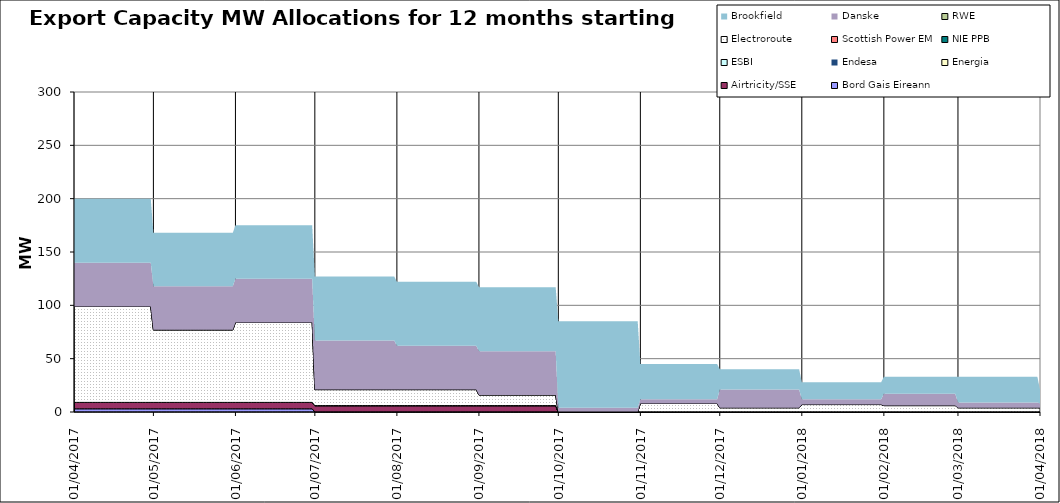
| Category | Bord Gais Eireann | Airtricity/SSE | Energia | Endesa | ESBI | NIE PPB | Scottish Power EM | Electroroute | RWE | Danske | Brookfield  |
|---|---|---|---|---|---|---|---|---|---|---|---|
| 01/04/2017 | 3 | 6 | 0 | 0 | 0 | 0 | 0 | 90 | 0 | 41 | 60 |
| 02/04/2017 | 3 | 6 | 0 | 0 | 0 | 0 | 0 | 90 | 0 | 41 | 60 |
| 03/04/2017 | 3 | 6 | 0 | 0 | 0 | 0 | 0 | 90 | 0 | 41 | 60 |
| 04/04/2017 | 3 | 6 | 0 | 0 | 0 | 0 | 0 | 90 | 0 | 41 | 60 |
| 05/04/2017 | 3 | 6 | 0 | 0 | 0 | 0 | 0 | 90 | 0 | 41 | 60 |
| 06/04/2017 | 3 | 6 | 0 | 0 | 0 | 0 | 0 | 90 | 0 | 41 | 60 |
| 07/04/2017 | 3 | 6 | 0 | 0 | 0 | 0 | 0 | 90 | 0 | 41 | 60 |
| 08/04/2017 | 3 | 6 | 0 | 0 | 0 | 0 | 0 | 90 | 0 | 41 | 60 |
| 09/04/2017 | 3 | 6 | 0 | 0 | 0 | 0 | 0 | 90 | 0 | 41 | 60 |
| 10/04/2017 | 3 | 6 | 0 | 0 | 0 | 0 | 0 | 90 | 0 | 41 | 60 |
| 11/04/2017 | 3 | 6 | 0 | 0 | 0 | 0 | 0 | 90 | 0 | 41 | 60 |
| 12/04/2017 | 3 | 6 | 0 | 0 | 0 | 0 | 0 | 90 | 0 | 41 | 60 |
| 13/04/2017 | 3 | 6 | 0 | 0 | 0 | 0 | 0 | 90 | 0 | 41 | 60 |
| 14/04/2017 | 3 | 6 | 0 | 0 | 0 | 0 | 0 | 90 | 0 | 41 | 60 |
| 15/04/2017 | 3 | 6 | 0 | 0 | 0 | 0 | 0 | 90 | 0 | 41 | 60 |
| 16/04/2017 | 3 | 6 | 0 | 0 | 0 | 0 | 0 | 90 | 0 | 41 | 60 |
| 17/04/2017 | 3 | 6 | 0 | 0 | 0 | 0 | 0 | 90 | 0 | 41 | 60 |
| 18/04/2017 | 3 | 6 | 0 | 0 | 0 | 0 | 0 | 90 | 0 | 41 | 60 |
| 19/04/2017 | 3 | 6 | 0 | 0 | 0 | 0 | 0 | 90 | 0 | 41 | 60 |
| 20/04/2017 | 3 | 6 | 0 | 0 | 0 | 0 | 0 | 90 | 0 | 41 | 60 |
| 21/04/2017 | 3 | 6 | 0 | 0 | 0 | 0 | 0 | 90 | 0 | 41 | 60 |
| 22/04/2017 | 3 | 6 | 0 | 0 | 0 | 0 | 0 | 90 | 0 | 41 | 60 |
| 23/04/2017 | 3 | 6 | 0 | 0 | 0 | 0 | 0 | 90 | 0 | 41 | 60 |
| 24/04/2017 | 3 | 6 | 0 | 0 | 0 | 0 | 0 | 90 | 0 | 41 | 60 |
| 25/04/2017 | 3 | 6 | 0 | 0 | 0 | 0 | 0 | 90 | 0 | 41 | 60 |
| 26/04/2017 | 3 | 6 | 0 | 0 | 0 | 0 | 0 | 90 | 0 | 41 | 60 |
| 27/04/2017 | 3 | 6 | 0 | 0 | 0 | 0 | 0 | 90 | 0 | 41 | 60 |
| 28/04/2017 | 3 | 6 | 0 | 0 | 0 | 0 | 0 | 90 | 0 | 41 | 60 |
| 29/04/2017 | 3 | 6 | 0 | 0 | 0 | 0 | 0 | 90 | 0 | 41 | 60 |
| 30/04/2017 | 3 | 6 | 0 | 0 | 0 | 0 | 0 | 90 | 0 | 41 | 60 |
| 01/05/2017 | 3 | 6 | 0 | 0 | 0 | 0 | 0 | 68 | 0 | 41 | 50 |
| 02/05/2017 | 3 | 6 | 0 | 0 | 0 | 0 | 0 | 68 | 0 | 41 | 50 |
| 03/05/2017 | 3 | 6 | 0 | 0 | 0 | 0 | 0 | 68 | 0 | 41 | 50 |
| 04/05/2017 | 3 | 6 | 0 | 0 | 0 | 0 | 0 | 68 | 0 | 41 | 50 |
| 05/05/2017 | 3 | 6 | 0 | 0 | 0 | 0 | 0 | 68 | 0 | 41 | 50 |
| 06/05/2017 | 3 | 6 | 0 | 0 | 0 | 0 | 0 | 68 | 0 | 41 | 50 |
| 07/05/2017 | 3 | 6 | 0 | 0 | 0 | 0 | 0 | 68 | 0 | 41 | 50 |
| 08/05/2017 | 3 | 6 | 0 | 0 | 0 | 0 | 0 | 68 | 0 | 41 | 50 |
| 09/05/2017 | 3 | 6 | 0 | 0 | 0 | 0 | 0 | 68 | 0 | 41 | 50 |
| 10/05/2017 | 3 | 6 | 0 | 0 | 0 | 0 | 0 | 68 | 0 | 41 | 50 |
| 11/05/2017 | 3 | 6 | 0 | 0 | 0 | 0 | 0 | 68 | 0 | 41 | 50 |
| 12/05/2017 | 3 | 6 | 0 | 0 | 0 | 0 | 0 | 68 | 0 | 41 | 50 |
| 13/05/2017 | 3 | 6 | 0 | 0 | 0 | 0 | 0 | 68 | 0 | 41 | 50 |
| 14/05/2017 | 3 | 6 | 0 | 0 | 0 | 0 | 0 | 68 | 0 | 41 | 50 |
| 15/05/2017 | 3 | 6 | 0 | 0 | 0 | 0 | 0 | 68 | 0 | 41 | 50 |
| 16/05/2017 | 3 | 6 | 0 | 0 | 0 | 0 | 0 | 68 | 0 | 41 | 50 |
| 17/05/2017 | 3 | 6 | 0 | 0 | 0 | 0 | 0 | 68 | 0 | 41 | 50 |
| 18/05/2017 | 3 | 6 | 0 | 0 | 0 | 0 | 0 | 68 | 0 | 41 | 50 |
| 19/05/2017 | 3 | 6 | 0 | 0 | 0 | 0 | 0 | 68 | 0 | 41 | 50 |
| 20/05/2017 | 3 | 6 | 0 | 0 | 0 | 0 | 0 | 68 | 0 | 41 | 50 |
| 21/05/2017 | 3 | 6 | 0 | 0 | 0 | 0 | 0 | 68 | 0 | 41 | 50 |
| 22/05/2017 | 3 | 6 | 0 | 0 | 0 | 0 | 0 | 68 | 0 | 41 | 50 |
| 23/05/2017 | 3 | 6 | 0 | 0 | 0 | 0 | 0 | 68 | 0 | 41 | 50 |
| 24/05/2017 | 3 | 6 | 0 | 0 | 0 | 0 | 0 | 68 | 0 | 41 | 50 |
| 25/05/2017 | 3 | 6 | 0 | 0 | 0 | 0 | 0 | 68 | 0 | 41 | 50 |
| 26/05/2017 | 3 | 6 | 0 | 0 | 0 | 0 | 0 | 68 | 0 | 41 | 50 |
| 27/05/2017 | 3 | 6 | 0 | 0 | 0 | 0 | 0 | 68 | 0 | 41 | 50 |
| 28/05/2017 | 3 | 6 | 0 | 0 | 0 | 0 | 0 | 68 | 0 | 41 | 50 |
| 29/05/2017 | 3 | 6 | 0 | 0 | 0 | 0 | 0 | 68 | 0 | 41 | 50 |
| 30/05/2017 | 3 | 6 | 0 | 0 | 0 | 0 | 0 | 68 | 0 | 41 | 50 |
| 31/05/2017 | 3 | 6 | 0 | 0 | 0 | 0 | 0 | 68 | 0 | 41 | 50 |
| 01/06/2017 | 3 | 6 | 0 | 0 | 0 | 0 | 0 | 75 | 0 | 41 | 50 |
| 02/06/2017 | 3 | 6 | 0 | 0 | 0 | 0 | 0 | 75 | 0 | 41 | 50 |
| 03/06/2017 | 3 | 6 | 0 | 0 | 0 | 0 | 0 | 75 | 0 | 41 | 50 |
| 04/06/2017 | 3 | 6 | 0 | 0 | 0 | 0 | 0 | 75 | 0 | 41 | 50 |
| 05/06/2017 | 3 | 6 | 0 | 0 | 0 | 0 | 0 | 75 | 0 | 41 | 50 |
| 06/06/2017 | 3 | 6 | 0 | 0 | 0 | 0 | 0 | 75 | 0 | 41 | 50 |
| 07/06/2017 | 3 | 6 | 0 | 0 | 0 | 0 | 0 | 75 | 0 | 41 | 50 |
| 08/06/2017 | 3 | 6 | 0 | 0 | 0 | 0 | 0 | 75 | 0 | 41 | 50 |
| 09/06/2017 | 3 | 6 | 0 | 0 | 0 | 0 | 0 | 75 | 0 | 41 | 50 |
| 10/06/2017 | 3 | 6 | 0 | 0 | 0 | 0 | 0 | 75 | 0 | 41 | 50 |
| 11/06/2017 | 3 | 6 | 0 | 0 | 0 | 0 | 0 | 75 | 0 | 41 | 50 |
| 12/06/2017 | 3 | 6 | 0 | 0 | 0 | 0 | 0 | 75 | 0 | 41 | 50 |
| 13/06/2017 | 3 | 6 | 0 | 0 | 0 | 0 | 0 | 75 | 0 | 41 | 50 |
| 14/06/2017 | 3 | 6 | 0 | 0 | 0 | 0 | 0 | 75 | 0 | 41 | 50 |
| 15/06/2017 | 3 | 6 | 0 | 0 | 0 | 0 | 0 | 75 | 0 | 41 | 50 |
| 16/06/2017 | 3 | 6 | 0 | 0 | 0 | 0 | 0 | 75 | 0 | 41 | 50 |
| 17/06/2017 | 3 | 6 | 0 | 0 | 0 | 0 | 0 | 75 | 0 | 41 | 50 |
| 18/06/2017 | 3 | 6 | 0 | 0 | 0 | 0 | 0 | 75 | 0 | 41 | 50 |
| 19/06/2017 | 3 | 6 | 0 | 0 | 0 | 0 | 0 | 75 | 0 | 41 | 50 |
| 20/06/2017 | 3 | 6 | 0 | 0 | 0 | 0 | 0 | 75 | 0 | 41 | 50 |
| 21/06/2017 | 3 | 6 | 0 | 0 | 0 | 0 | 0 | 75 | 0 | 41 | 50 |
| 22/06/2017 | 3 | 6 | 0 | 0 | 0 | 0 | 0 | 75 | 0 | 41 | 50 |
| 23/06/2017 | 3 | 6 | 0 | 0 | 0 | 0 | 0 | 75 | 0 | 41 | 50 |
| 24/06/2017 | 3 | 6 | 0 | 0 | 0 | 0 | 0 | 75 | 0 | 41 | 50 |
| 25/06/2017 | 3 | 6 | 0 | 0 | 0 | 0 | 0 | 75 | 0 | 41 | 50 |
| 26/06/2017 | 3 | 6 | 0 | 0 | 0 | 0 | 0 | 75 | 0 | 41 | 50 |
| 27/06/2017 | 3 | 6 | 0 | 0 | 0 | 0 | 0 | 75 | 0 | 41 | 50 |
| 28/06/2017 | 3 | 6 | 0 | 0 | 0 | 0 | 0 | 75 | 0 | 41 | 50 |
| 29/06/2017 | 3 | 6 | 0 | 0 | 0 | 0 | 0 | 75 | 0 | 41 | 50 |
| 30/06/2017 | 3 | 6 | 0 | 0 | 0 | 0 | 0 | 75 | 0 | 41 | 50 |
| 01/07/2017 | 0 | 6 | 0 | 0 | 0 | 0 | 0 | 15 | 0 | 46 | 60 |
| 02/07/2017 | 0 | 6 | 0 | 0 | 0 | 0 | 0 | 15 | 0 | 46 | 60 |
| 03/07/2017 | 0 | 6 | 0 | 0 | 0 | 0 | 0 | 15 | 0 | 46 | 60 |
| 04/07/2017 | 0 | 6 | 0 | 0 | 0 | 0 | 0 | 15 | 0 | 46 | 60 |
| 05/07/2017 | 0 | 6 | 0 | 0 | 0 | 0 | 0 | 15 | 0 | 46 | 60 |
| 06/07/2017 | 0 | 6 | 0 | 0 | 0 | 0 | 0 | 15 | 0 | 46 | 60 |
| 07/07/2017 | 0 | 6 | 0 | 0 | 0 | 0 | 0 | 15 | 0 | 46 | 60 |
| 08/07/2017 | 0 | 6 | 0 | 0 | 0 | 0 | 0 | 15 | 0 | 46 | 60 |
| 09/07/2017 | 0 | 6 | 0 | 0 | 0 | 0 | 0 | 15 | 0 | 46 | 60 |
| 10/07/2017 | 0 | 6 | 0 | 0 | 0 | 0 | 0 | 15 | 0 | 46 | 60 |
| 11/07/2017 | 0 | 6 | 0 | 0 | 0 | 0 | 0 | 15 | 0 | 46 | 60 |
| 12/07/2017 | 0 | 6 | 0 | 0 | 0 | 0 | 0 | 15 | 0 | 46 | 60 |
| 13/07/2017 | 0 | 6 | 0 | 0 | 0 | 0 | 0 | 15 | 0 | 46 | 60 |
| 14/07/2017 | 0 | 6 | 0 | 0 | 0 | 0 | 0 | 15 | 0 | 46 | 60 |
| 15/07/2017 | 0 | 6 | 0 | 0 | 0 | 0 | 0 | 15 | 0 | 46 | 60 |
| 16/07/2017 | 0 | 6 | 0 | 0 | 0 | 0 | 0 | 15 | 0 | 46 | 60 |
| 17/07/2017 | 0 | 6 | 0 | 0 | 0 | 0 | 0 | 15 | 0 | 46 | 60 |
| 18/07/2017 | 0 | 6 | 0 | 0 | 0 | 0 | 0 | 15 | 0 | 46 | 60 |
| 19/07/2017 | 0 | 6 | 0 | 0 | 0 | 0 | 0 | 15 | 0 | 46 | 60 |
| 20/07/2017 | 0 | 6 | 0 | 0 | 0 | 0 | 0 | 15 | 0 | 46 | 60 |
| 21/07/2017 | 0 | 6 | 0 | 0 | 0 | 0 | 0 | 15 | 0 | 46 | 60 |
| 22/07/2017 | 0 | 6 | 0 | 0 | 0 | 0 | 0 | 15 | 0 | 46 | 60 |
| 23/07/2017 | 0 | 6 | 0 | 0 | 0 | 0 | 0 | 15 | 0 | 46 | 60 |
| 24/07/2017 | 0 | 6 | 0 | 0 | 0 | 0 | 0 | 15 | 0 | 46 | 60 |
| 25/07/2017 | 0 | 6 | 0 | 0 | 0 | 0 | 0 | 15 | 0 | 46 | 60 |
| 26/07/2017 | 0 | 6 | 0 | 0 | 0 | 0 | 0 | 15 | 0 | 46 | 60 |
| 27/07/2017 | 0 | 6 | 0 | 0 | 0 | 0 | 0 | 15 | 0 | 46 | 60 |
| 28/07/2017 | 0 | 6 | 0 | 0 | 0 | 0 | 0 | 15 | 0 | 46 | 60 |
| 29/07/2017 | 0 | 6 | 0 | 0 | 0 | 0 | 0 | 15 | 0 | 46 | 60 |
| 30/07/2017 | 0 | 6 | 0 | 0 | 0 | 0 | 0 | 15 | 0 | 46 | 60 |
| 31/07/2017 | 0 | 6 | 0 | 0 | 0 | 0 | 0 | 15 | 0 | 46 | 60 |
| 01/08/2017 | 0 | 6 | 0 | 0 | 0 | 0 | 0 | 15 | 0 | 41 | 60 |
| 02/08/2017 | 0 | 6 | 0 | 0 | 0 | 0 | 0 | 15 | 0 | 41 | 60 |
| 03/08/2017 | 0 | 6 | 0 | 0 | 0 | 0 | 0 | 15 | 0 | 41 | 60 |
| 04/08/2017 | 0 | 6 | 0 | 0 | 0 | 0 | 0 | 15 | 0 | 41 | 60 |
| 05/08/2017 | 0 | 6 | 0 | 0 | 0 | 0 | 0 | 15 | 0 | 41 | 60 |
| 06/08/2017 | 0 | 6 | 0 | 0 | 0 | 0 | 0 | 15 | 0 | 41 | 60 |
| 07/08/2017 | 0 | 6 | 0 | 0 | 0 | 0 | 0 | 15 | 0 | 41 | 60 |
| 08/08/2017 | 0 | 6 | 0 | 0 | 0 | 0 | 0 | 15 | 0 | 41 | 60 |
| 09/08/2017 | 0 | 6 | 0 | 0 | 0 | 0 | 0 | 15 | 0 | 41 | 60 |
| 10/08/2017 | 0 | 6 | 0 | 0 | 0 | 0 | 0 | 15 | 0 | 41 | 60 |
| 11/08/2017 | 0 | 6 | 0 | 0 | 0 | 0 | 0 | 15 | 0 | 41 | 60 |
| 12/08/2017 | 0 | 6 | 0 | 0 | 0 | 0 | 0 | 15 | 0 | 41 | 60 |
| 13/08/2017 | 0 | 6 | 0 | 0 | 0 | 0 | 0 | 15 | 0 | 41 | 60 |
| 14/08/2017 | 0 | 6 | 0 | 0 | 0 | 0 | 0 | 15 | 0 | 41 | 60 |
| 15/08/2017 | 0 | 6 | 0 | 0 | 0 | 0 | 0 | 15 | 0 | 41 | 60 |
| 16/08/2017 | 0 | 6 | 0 | 0 | 0 | 0 | 0 | 15 | 0 | 41 | 60 |
| 17/08/2017 | 0 | 6 | 0 | 0 | 0 | 0 | 0 | 15 | 0 | 41 | 60 |
| 18/08/2017 | 0 | 6 | 0 | 0 | 0 | 0 | 0 | 15 | 0 | 41 | 60 |
| 19/08/2017 | 0 | 6 | 0 | 0 | 0 | 0 | 0 | 15 | 0 | 41 | 60 |
| 20/08/2017 | 0 | 6 | 0 | 0 | 0 | 0 | 0 | 15 | 0 | 41 | 60 |
| 21/08/2017 | 0 | 6 | 0 | 0 | 0 | 0 | 0 | 15 | 0 | 41 | 60 |
| 22/08/2017 | 0 | 6 | 0 | 0 | 0 | 0 | 0 | 15 | 0 | 41 | 60 |
| 23/08/2017 | 0 | 6 | 0 | 0 | 0 | 0 | 0 | 15 | 0 | 41 | 60 |
| 24/08/2017 | 0 | 6 | 0 | 0 | 0 | 0 | 0 | 15 | 0 | 41 | 60 |
| 25/08/2017 | 0 | 6 | 0 | 0 | 0 | 0 | 0 | 15 | 0 | 41 | 60 |
| 26/08/2017 | 0 | 6 | 0 | 0 | 0 | 0 | 0 | 15 | 0 | 41 | 60 |
| 27/08/2017 | 0 | 6 | 0 | 0 | 0 | 0 | 0 | 15 | 0 | 41 | 60 |
| 28/08/2017 | 0 | 6 | 0 | 0 | 0 | 0 | 0 | 15 | 0 | 41 | 60 |
| 29/08/2017 | 0 | 6 | 0 | 0 | 0 | 0 | 0 | 15 | 0 | 41 | 60 |
| 30/08/2017 | 0 | 6 | 0 | 0 | 0 | 0 | 0 | 15 | 0 | 41 | 60 |
| 31/08/2017 | 0 | 6 | 0 | 0 | 0 | 0 | 0 | 15 | 0 | 41 | 60 |
| 01/09/2017 | 0 | 6 | 0 | 0 | 0 | 0 | 0 | 10 | 0 | 41 | 60 |
| 02/09/2017 | 0 | 6 | 0 | 0 | 0 | 0 | 0 | 10 | 0 | 41 | 60 |
| 03/09/2017 | 0 | 6 | 0 | 0 | 0 | 0 | 0 | 10 | 0 | 41 | 60 |
| 04/09/2017 | 0 | 6 | 0 | 0 | 0 | 0 | 0 | 10 | 0 | 41 | 60 |
| 05/09/2017 | 0 | 6 | 0 | 0 | 0 | 0 | 0 | 10 | 0 | 41 | 60 |
| 06/09/2017 | 0 | 6 | 0 | 0 | 0 | 0 | 0 | 10 | 0 | 41 | 60 |
| 07/09/2017 | 0 | 6 | 0 | 0 | 0 | 0 | 0 | 10 | 0 | 41 | 60 |
| 08/09/2017 | 0 | 6 | 0 | 0 | 0 | 0 | 0 | 10 | 0 | 41 | 60 |
| 09/09/2017 | 0 | 6 | 0 | 0 | 0 | 0 | 0 | 10 | 0 | 41 | 60 |
| 10/09/2017 | 0 | 6 | 0 | 0 | 0 | 0 | 0 | 10 | 0 | 41 | 60 |
| 11/09/2017 | 0 | 6 | 0 | 0 | 0 | 0 | 0 | 10 | 0 | 41 | 60 |
| 12/09/2017 | 0 | 6 | 0 | 0 | 0 | 0 | 0 | 10 | 0 | 41 | 60 |
| 13/09/2017 | 0 | 6 | 0 | 0 | 0 | 0 | 0 | 10 | 0 | 41 | 60 |
| 14/09/2017 | 0 | 6 | 0 | 0 | 0 | 0 | 0 | 10 | 0 | 41 | 60 |
| 15/09/2017 | 0 | 6 | 0 | 0 | 0 | 0 | 0 | 10 | 0 | 41 | 60 |
| 16/09/2017 | 0 | 6 | 0 | 0 | 0 | 0 | 0 | 10 | 0 | 41 | 60 |
| 17/09/2017 | 0 | 6 | 0 | 0 | 0 | 0 | 0 | 10 | 0 | 41 | 60 |
| 18/09/2017 | 0 | 6 | 0 | 0 | 0 | 0 | 0 | 10 | 0 | 41 | 60 |
| 19/09/2017 | 0 | 6 | 0 | 0 | 0 | 0 | 0 | 10 | 0 | 41 | 60 |
| 20/09/2017 | 0 | 6 | 0 | 0 | 0 | 0 | 0 | 10 | 0 | 41 | 60 |
| 21/09/2017 | 0 | 6 | 0 | 0 | 0 | 0 | 0 | 10 | 0 | 41 | 60 |
| 22/09/2017 | 0 | 6 | 0 | 0 | 0 | 0 | 0 | 10 | 0 | 41 | 60 |
| 23/09/2017 | 0 | 6 | 0 | 0 | 0 | 0 | 0 | 10 | 0 | 41 | 60 |
| 24/09/2017 | 0 | 6 | 0 | 0 | 0 | 0 | 0 | 10 | 0 | 41 | 60 |
| 25/09/2017 | 0 | 6 | 0 | 0 | 0 | 0 | 0 | 10 | 0 | 41 | 60 |
| 26/09/2017 | 0 | 6 | 0 | 0 | 0 | 0 | 0 | 10 | 0 | 41 | 60 |
| 27/09/2017 | 0 | 6 | 0 | 0 | 0 | 0 | 0 | 10 | 0 | 41 | 60 |
| 28/09/2017 | 0 | 6 | 0 | 0 | 0 | 0 | 0 | 10 | 0 | 41 | 60 |
| 29/09/2017 | 0 | 6 | 0 | 0 | 0 | 0 | 0 | 10 | 0 | 41 | 60 |
| 30/09/2017 | 0 | 6 | 0 | 0 | 0 | 0 | 0 | 10 | 0 | 41 | 60 |
| 01/10/2017 | 0 | 0 | 0 | 0 | 0 | 0 | 0 | 0 | 0 | 4 | 81 |
| 02/10/2017 | 0 | 0 | 0 | 0 | 0 | 0 | 0 | 0 | 0 | 4 | 81 |
| 03/10/2017 | 0 | 0 | 0 | 0 | 0 | 0 | 0 | 0 | 0 | 4 | 81 |
| 04/10/2017 | 0 | 0 | 0 | 0 | 0 | 0 | 0 | 0 | 0 | 4 | 81 |
| 05/10/2017 | 0 | 0 | 0 | 0 | 0 | 0 | 0 | 0 | 0 | 4 | 81 |
| 06/10/2017 | 0 | 0 | 0 | 0 | 0 | 0 | 0 | 0 | 0 | 4 | 81 |
| 07/10/2017 | 0 | 0 | 0 | 0 | 0 | 0 | 0 | 0 | 0 | 4 | 81 |
| 08/10/2017 | 0 | 0 | 0 | 0 | 0 | 0 | 0 | 0 | 0 | 4 | 81 |
| 09/10/2017 | 0 | 0 | 0 | 0 | 0 | 0 | 0 | 0 | 0 | 4 | 81 |
| 10/10/2017 | 0 | 0 | 0 | 0 | 0 | 0 | 0 | 0 | 0 | 4 | 81 |
| 11/10/2017 | 0 | 0 | 0 | 0 | 0 | 0 | 0 | 0 | 0 | 4 | 81 |
| 12/10/2017 | 0 | 0 | 0 | 0 | 0 | 0 | 0 | 0 | 0 | 4 | 81 |
| 13/10/2017 | 0 | 0 | 0 | 0 | 0 | 0 | 0 | 0 | 0 | 4 | 81 |
| 14/10/2017 | 0 | 0 | 0 | 0 | 0 | 0 | 0 | 0 | 0 | 4 | 81 |
| 15/10/2017 | 0 | 0 | 0 | 0 | 0 | 0 | 0 | 0 | 0 | 4 | 81 |
| 16/10/2017 | 0 | 0 | 0 | 0 | 0 | 0 | 0 | 0 | 0 | 4 | 81 |
| 17/10/2017 | 0 | 0 | 0 | 0 | 0 | 0 | 0 | 0 | 0 | 4 | 81 |
| 18/10/2017 | 0 | 0 | 0 | 0 | 0 | 0 | 0 | 0 | 0 | 4 | 81 |
| 19/10/2017 | 0 | 0 | 0 | 0 | 0 | 0 | 0 | 0 | 0 | 4 | 81 |
| 20/10/2017 | 0 | 0 | 0 | 0 | 0 | 0 | 0 | 0 | 0 | 4 | 81 |
| 21/10/2017 | 0 | 0 | 0 | 0 | 0 | 0 | 0 | 0 | 0 | 4 | 81 |
| 22/10/2017 | 0 | 0 | 0 | 0 | 0 | 0 | 0 | 0 | 0 | 4 | 81 |
| 23/10/2017 | 0 | 0 | 0 | 0 | 0 | 0 | 0 | 0 | 0 | 4 | 81 |
| 24/10/2017 | 0 | 0 | 0 | 0 | 0 | 0 | 0 | 0 | 0 | 4 | 81 |
| 25/10/2017 | 0 | 0 | 0 | 0 | 0 | 0 | 0 | 0 | 0 | 4 | 81 |
| 26/10/2017 | 0 | 0 | 0 | 0 | 0 | 0 | 0 | 0 | 0 | 4 | 81 |
| 27/10/2017 | 0 | 0 | 0 | 0 | 0 | 0 | 0 | 0 | 0 | 4 | 81 |
| 28/10/2017 | 0 | 0 | 0 | 0 | 0 | 0 | 0 | 0 | 0 | 4 | 81 |
| 29/10/2017 | 0 | 0 | 0 | 0 | 0 | 0 | 0 | 0 | 0 | 4 | 81 |
| 30/10/2017 | 0 | 0 | 0 | 0 | 0 | 0 | 0 | 0 | 0 | 4 | 81 |
| 31/10/2017 | 0 | 0 | 0 | 0 | 0 | 0 | 0 | 0 | 0 | 4 | 81 |
| 01/11/2017 | 0 | 0 | 0 | 0 | 0 | 0 | 0 | 8 | 0 | 4 | 33 |
| 02/11/2017 | 0 | 0 | 0 | 0 | 0 | 0 | 0 | 8 | 0 | 4 | 33 |
| 03/11/2017 | 0 | 0 | 0 | 0 | 0 | 0 | 0 | 8 | 0 | 4 | 33 |
| 04/11/2017 | 0 | 0 | 0 | 0 | 0 | 0 | 0 | 8 | 0 | 4 | 33 |
| 05/11/2017 | 0 | 0 | 0 | 0 | 0 | 0 | 0 | 8 | 0 | 4 | 33 |
| 06/11/2017 | 0 | 0 | 0 | 0 | 0 | 0 | 0 | 8 | 0 | 4 | 33 |
| 07/11/2017 | 0 | 0 | 0 | 0 | 0 | 0 | 0 | 8 | 0 | 4 | 33 |
| 08/11/2017 | 0 | 0 | 0 | 0 | 0 | 0 | 0 | 8 | 0 | 4 | 33 |
| 09/11/2017 | 0 | 0 | 0 | 0 | 0 | 0 | 0 | 8 | 0 | 4 | 33 |
| 10/11/2017 | 0 | 0 | 0 | 0 | 0 | 0 | 0 | 8 | 0 | 4 | 33 |
| 11/11/2017 | 0 | 0 | 0 | 0 | 0 | 0 | 0 | 8 | 0 | 4 | 33 |
| 12/11/2017 | 0 | 0 | 0 | 0 | 0 | 0 | 0 | 8 | 0 | 4 | 33 |
| 13/11/2017 | 0 | 0 | 0 | 0 | 0 | 0 | 0 | 8 | 0 | 4 | 33 |
| 14/11/2017 | 0 | 0 | 0 | 0 | 0 | 0 | 0 | 8 | 0 | 4 | 33 |
| 15/11/2017 | 0 | 0 | 0 | 0 | 0 | 0 | 0 | 8 | 0 | 4 | 33 |
| 16/11/2017 | 0 | 0 | 0 | 0 | 0 | 0 | 0 | 8 | 0 | 4 | 33 |
| 17/11/2017 | 0 | 0 | 0 | 0 | 0 | 0 | 0 | 8 | 0 | 4 | 33 |
| 18/11/2017 | 0 | 0 | 0 | 0 | 0 | 0 | 0 | 8 | 0 | 4 | 33 |
| 19/11/2017 | 0 | 0 | 0 | 0 | 0 | 0 | 0 | 8 | 0 | 4 | 33 |
| 20/11/2017 | 0 | 0 | 0 | 0 | 0 | 0 | 0 | 8 | 0 | 4 | 33 |
| 21/11/2017 | 0 | 0 | 0 | 0 | 0 | 0 | 0 | 8 | 0 | 4 | 33 |
| 22/11/2017 | 0 | 0 | 0 | 0 | 0 | 0 | 0 | 8 | 0 | 4 | 33 |
| 23/11/2017 | 0 | 0 | 0 | 0 | 0 | 0 | 0 | 8 | 0 | 4 | 33 |
| 24/11/2017 | 0 | 0 | 0 | 0 | 0 | 0 | 0 | 8 | 0 | 4 | 33 |
| 25/11/2017 | 0 | 0 | 0 | 0 | 0 | 0 | 0 | 8 | 0 | 4 | 33 |
| 26/11/2017 | 0 | 0 | 0 | 0 | 0 | 0 | 0 | 8 | 0 | 4 | 33 |
| 27/11/2017 | 0 | 0 | 0 | 0 | 0 | 0 | 0 | 8 | 0 | 4 | 33 |
| 28/11/2017 | 0 | 0 | 0 | 0 | 0 | 0 | 0 | 8 | 0 | 4 | 33 |
| 29/11/2017 | 0 | 0 | 0 | 0 | 0 | 0 | 0 | 8 | 0 | 4 | 33 |
| 30/11/2017 | 0 | 0 | 0 | 0 | 0 | 0 | 0 | 8 | 0 | 4 | 33 |
| 01/12/2017 | 0 | 0 | 0 | 0 | 0 | 0 | 0 | 4 | 0 | 17 | 19 |
| 02/12/2017 | 0 | 0 | 0 | 0 | 0 | 0 | 0 | 4 | 0 | 17 | 19 |
| 03/12/2017 | 0 | 0 | 0 | 0 | 0 | 0 | 0 | 4 | 0 | 17 | 19 |
| 04/12/2017 | 0 | 0 | 0 | 0 | 0 | 0 | 0 | 4 | 0 | 17 | 19 |
| 05/12/2017 | 0 | 0 | 0 | 0 | 0 | 0 | 0 | 4 | 0 | 17 | 19 |
| 06/12/2017 | 0 | 0 | 0 | 0 | 0 | 0 | 0 | 4 | 0 | 17 | 19 |
| 07/12/2017 | 0 | 0 | 0 | 0 | 0 | 0 | 0 | 4 | 0 | 17 | 19 |
| 08/12/2017 | 0 | 0 | 0 | 0 | 0 | 0 | 0 | 4 | 0 | 17 | 19 |
| 09/12/2017 | 0 | 0 | 0 | 0 | 0 | 0 | 0 | 4 | 0 | 17 | 19 |
| 10/12/2017 | 0 | 0 | 0 | 0 | 0 | 0 | 0 | 4 | 0 | 17 | 19 |
| 11/12/2017 | 0 | 0 | 0 | 0 | 0 | 0 | 0 | 4 | 0 | 17 | 19 |
| 12/12/2017 | 0 | 0 | 0 | 0 | 0 | 0 | 0 | 4 | 0 | 17 | 19 |
| 13/12/2017 | 0 | 0 | 0 | 0 | 0 | 0 | 0 | 4 | 0 | 17 | 19 |
| 14/12/2017 | 0 | 0 | 0 | 0 | 0 | 0 | 0 | 4 | 0 | 17 | 19 |
| 15/12/2017 | 0 | 0 | 0 | 0 | 0 | 0 | 0 | 4 | 0 | 17 | 19 |
| 16/12/2017 | 0 | 0 | 0 | 0 | 0 | 0 | 0 | 4 | 0 | 17 | 19 |
| 17/12/2017 | 0 | 0 | 0 | 0 | 0 | 0 | 0 | 4 | 0 | 17 | 19 |
| 18/12/2017 | 0 | 0 | 0 | 0 | 0 | 0 | 0 | 4 | 0 | 17 | 19 |
| 19/12/2017 | 0 | 0 | 0 | 0 | 0 | 0 | 0 | 4 | 0 | 17 | 19 |
| 20/12/2017 | 0 | 0 | 0 | 0 | 0 | 0 | 0 | 4 | 0 | 17 | 19 |
| 21/12/2017 | 0 | 0 | 0 | 0 | 0 | 0 | 0 | 4 | 0 | 17 | 19 |
| 22/12/2017 | 0 | 0 | 0 | 0 | 0 | 0 | 0 | 4 | 0 | 17 | 19 |
| 23/12/2017 | 0 | 0 | 0 | 0 | 0 | 0 | 0 | 4 | 0 | 17 | 19 |
| 24/12/2017 | 0 | 0 | 0 | 0 | 0 | 0 | 0 | 4 | 0 | 17 | 19 |
| 25/12/2017 | 0 | 0 | 0 | 0 | 0 | 0 | 0 | 4 | 0 | 17 | 19 |
| 26/12/2017 | 0 | 0 | 0 | 0 | 0 | 0 | 0 | 4 | 0 | 17 | 19 |
| 27/12/2017 | 0 | 0 | 0 | 0 | 0 | 0 | 0 | 4 | 0 | 17 | 19 |
| 28/12/2017 | 0 | 0 | 0 | 0 | 0 | 0 | 0 | 4 | 0 | 17 | 19 |
| 29/12/2017 | 0 | 0 | 0 | 0 | 0 | 0 | 0 | 4 | 0 | 17 | 19 |
| 30/12/2017 | 0 | 0 | 0 | 0 | 0 | 0 | 0 | 4 | 0 | 17 | 19 |
| 31/12/2017 | 0 | 0 | 0 | 0 | 0 | 0 | 0 | 4 | 0 | 17 | 19 |
| 01/01/2018 | 0 | 0 | 0 | 0 | 0 | 0 | 0 | 7 | 0 | 5 | 16 |
| 02/01/2018 | 0 | 0 | 0 | 0 | 0 | 0 | 0 | 7 | 0 | 5 | 16 |
| 03/01/2018 | 0 | 0 | 0 | 0 | 0 | 0 | 0 | 7 | 0 | 5 | 16 |
| 04/01/2018 | 0 | 0 | 0 | 0 | 0 | 0 | 0 | 7 | 0 | 5 | 16 |
| 05/01/2018 | 0 | 0 | 0 | 0 | 0 | 0 | 0 | 7 | 0 | 5 | 16 |
| 06/01/2018 | 0 | 0 | 0 | 0 | 0 | 0 | 0 | 7 | 0 | 5 | 16 |
| 07/01/2018 | 0 | 0 | 0 | 0 | 0 | 0 | 0 | 7 | 0 | 5 | 16 |
| 08/01/2018 | 0 | 0 | 0 | 0 | 0 | 0 | 0 | 7 | 0 | 5 | 16 |
| 09/01/2018 | 0 | 0 | 0 | 0 | 0 | 0 | 0 | 7 | 0 | 5 | 16 |
| 10/01/2018 | 0 | 0 | 0 | 0 | 0 | 0 | 0 | 7 | 0 | 5 | 16 |
| 11/01/2018 | 0 | 0 | 0 | 0 | 0 | 0 | 0 | 7 | 0 | 5 | 16 |
| 12/01/2018 | 0 | 0 | 0 | 0 | 0 | 0 | 0 | 7 | 0 | 5 | 16 |
| 13/01/2018 | 0 | 0 | 0 | 0 | 0 | 0 | 0 | 7 | 0 | 5 | 16 |
| 14/01/2018 | 0 | 0 | 0 | 0 | 0 | 0 | 0 | 7 | 0 | 5 | 16 |
| 15/01/2018 | 0 | 0 | 0 | 0 | 0 | 0 | 0 | 7 | 0 | 5 | 16 |
| 16/01/2018 | 0 | 0 | 0 | 0 | 0 | 0 | 0 | 7 | 0 | 5 | 16 |
| 17/01/2018 | 0 | 0 | 0 | 0 | 0 | 0 | 0 | 7 | 0 | 5 | 16 |
| 18/01/2018 | 0 | 0 | 0 | 0 | 0 | 0 | 0 | 7 | 0 | 5 | 16 |
| 19/01/2018 | 0 | 0 | 0 | 0 | 0 | 0 | 0 | 7 | 0 | 5 | 16 |
| 20/01/2018 | 0 | 0 | 0 | 0 | 0 | 0 | 0 | 7 | 0 | 5 | 16 |
| 21/01/2018 | 0 | 0 | 0 | 0 | 0 | 0 | 0 | 7 | 0 | 5 | 16 |
| 22/01/2018 | 0 | 0 | 0 | 0 | 0 | 0 | 0 | 7 | 0 | 5 | 16 |
| 23/01/2018 | 0 | 0 | 0 | 0 | 0 | 0 | 0 | 7 | 0 | 5 | 16 |
| 24/01/2018 | 0 | 0 | 0 | 0 | 0 | 0 | 0 | 7 | 0 | 5 | 16 |
| 25/01/2018 | 0 | 0 | 0 | 0 | 0 | 0 | 0 | 7 | 0 | 5 | 16 |
| 26/01/2018 | 0 | 0 | 0 | 0 | 0 | 0 | 0 | 7 | 0 | 5 | 16 |
| 27/01/2018 | 0 | 0 | 0 | 0 | 0 | 0 | 0 | 7 | 0 | 5 | 16 |
| 28/01/2018 | 0 | 0 | 0 | 0 | 0 | 0 | 0 | 7 | 0 | 5 | 16 |
| 29/01/2018 | 0 | 0 | 0 | 0 | 0 | 0 | 0 | 7 | 0 | 5 | 16 |
| 30/01/2018 | 0 | 0 | 0 | 0 | 0 | 0 | 0 | 7 | 0 | 5 | 16 |
| 31/01/2018 | 0 | 0 | 0 | 0 | 0 | 0 | 0 | 7 | 0 | 5 | 16 |
| 01/02/2018 | 0 | 0 | 0 | 0 | 0 | 0 | 0 | 6 | 0 | 11 | 16 |
| 02/02/2018 | 0 | 0 | 0 | 0 | 0 | 0 | 0 | 6 | 0 | 11 | 16 |
| 03/02/2018 | 0 | 0 | 0 | 0 | 0 | 0 | 0 | 6 | 0 | 11 | 16 |
| 04/02/2018 | 0 | 0 | 0 | 0 | 0 | 0 | 0 | 6 | 0 | 11 | 16 |
| 05/02/2018 | 0 | 0 | 0 | 0 | 0 | 0 | 0 | 6 | 0 | 11 | 16 |
| 06/02/2018 | 0 | 0 | 0 | 0 | 0 | 0 | 0 | 6 | 0 | 11 | 16 |
| 07/02/2018 | 0 | 0 | 0 | 0 | 0 | 0 | 0 | 6 | 0 | 11 | 16 |
| 08/02/2018 | 0 | 0 | 0 | 0 | 0 | 0 | 0 | 6 | 0 | 11 | 16 |
| 09/02/2018 | 0 | 0 | 0 | 0 | 0 | 0 | 0 | 6 | 0 | 11 | 16 |
| 10/02/2018 | 0 | 0 | 0 | 0 | 0 | 0 | 0 | 6 | 0 | 11 | 16 |
| 11/02/2018 | 0 | 0 | 0 | 0 | 0 | 0 | 0 | 6 | 0 | 11 | 16 |
| 12/02/2018 | 0 | 0 | 0 | 0 | 0 | 0 | 0 | 6 | 0 | 11 | 16 |
| 13/02/2018 | 0 | 0 | 0 | 0 | 0 | 0 | 0 | 6 | 0 | 11 | 16 |
| 14/02/2018 | 0 | 0 | 0 | 0 | 0 | 0 | 0 | 6 | 0 | 11 | 16 |
| 15/02/2018 | 0 | 0 | 0 | 0 | 0 | 0 | 0 | 6 | 0 | 11 | 16 |
| 16/02/2018 | 0 | 0 | 0 | 0 | 0 | 0 | 0 | 6 | 0 | 11 | 16 |
| 17/02/2018 | 0 | 0 | 0 | 0 | 0 | 0 | 0 | 6 | 0 | 11 | 16 |
| 18/02/2018 | 0 | 0 | 0 | 0 | 0 | 0 | 0 | 6 | 0 | 11 | 16 |
| 19/02/2018 | 0 | 0 | 0 | 0 | 0 | 0 | 0 | 6 | 0 | 11 | 16 |
| 20/02/2018 | 0 | 0 | 0 | 0 | 0 | 0 | 0 | 6 | 0 | 11 | 16 |
| 21/02/2018 | 0 | 0 | 0 | 0 | 0 | 0 | 0 | 6 | 0 | 11 | 16 |
| 22/02/2018 | 0 | 0 | 0 | 0 | 0 | 0 | 0 | 6 | 0 | 11 | 16 |
| 23/02/2018 | 0 | 0 | 0 | 0 | 0 | 0 | 0 | 6 | 0 | 11 | 16 |
| 24/02/2018 | 0 | 0 | 0 | 0 | 0 | 0 | 0 | 6 | 0 | 11 | 16 |
| 25/02/2018 | 0 | 0 | 0 | 0 | 0 | 0 | 0 | 6 | 0 | 11 | 16 |
| 26/02/2018 | 0 | 0 | 0 | 0 | 0 | 0 | 0 | 6 | 0 | 11 | 16 |
| 27/02/2018 | 0 | 0 | 0 | 0 | 0 | 0 | 0 | 6 | 0 | 11 | 16 |
| 28/02/2018 | 0 | 0 | 0 | 0 | 0 | 0 | 0 | 6 | 0 | 11 | 16 |
| 01/03/2018 | 0 | 0 | 0 | 0 | 0 | 0 | 0 | 4 | 0 | 5 | 24 |
| 02/03/2018 | 0 | 0 | 0 | 0 | 0 | 0 | 0 | 4 | 0 | 5 | 24 |
| 03/03/2018 | 0 | 0 | 0 | 0 | 0 | 0 | 0 | 4 | 0 | 5 | 24 |
| 04/03/2018 | 0 | 0 | 0 | 0 | 0 | 0 | 0 | 4 | 0 | 5 | 24 |
| 05/03/2018 | 0 | 0 | 0 | 0 | 0 | 0 | 0 | 4 | 0 | 5 | 24 |
| 06/03/2018 | 0 | 0 | 0 | 0 | 0 | 0 | 0 | 4 | 0 | 5 | 24 |
| 07/03/2018 | 0 | 0 | 0 | 0 | 0 | 0 | 0 | 4 | 0 | 5 | 24 |
| 08/03/2018 | 0 | 0 | 0 | 0 | 0 | 0 | 0 | 4 | 0 | 5 | 24 |
| 09/03/2018 | 0 | 0 | 0 | 0 | 0 | 0 | 0 | 4 | 0 | 5 | 24 |
| 10/03/2018 | 0 | 0 | 0 | 0 | 0 | 0 | 0 | 4 | 0 | 5 | 24 |
| 11/03/2018 | 0 | 0 | 0 | 0 | 0 | 0 | 0 | 4 | 0 | 5 | 24 |
| 12/03/2018 | 0 | 0 | 0 | 0 | 0 | 0 | 0 | 4 | 0 | 5 | 24 |
| 13/03/2018 | 0 | 0 | 0 | 0 | 0 | 0 | 0 | 4 | 0 | 5 | 24 |
| 14/03/2018 | 0 | 0 | 0 | 0 | 0 | 0 | 0 | 4 | 0 | 5 | 24 |
| 15/03/2018 | 0 | 0 | 0 | 0 | 0 | 0 | 0 | 4 | 0 | 5 | 24 |
| 16/03/2018 | 0 | 0 | 0 | 0 | 0 | 0 | 0 | 4 | 0 | 5 | 24 |
| 17/03/2018 | 0 | 0 | 0 | 0 | 0 | 0 | 0 | 4 | 0 | 5 | 24 |
| 18/03/2018 | 0 | 0 | 0 | 0 | 0 | 0 | 0 | 4 | 0 | 5 | 24 |
| 19/03/2018 | 0 | 0 | 0 | 0 | 0 | 0 | 0 | 4 | 0 | 5 | 24 |
| 20/03/2018 | 0 | 0 | 0 | 0 | 0 | 0 | 0 | 4 | 0 | 5 | 24 |
| 21/03/2018 | 0 | 0 | 0 | 0 | 0 | 0 | 0 | 4 | 0 | 5 | 24 |
| 22/03/2018 | 0 | 0 | 0 | 0 | 0 | 0 | 0 | 4 | 0 | 5 | 24 |
| 23/03/2018 | 0 | 0 | 0 | 0 | 0 | 0 | 0 | 4 | 0 | 5 | 24 |
| 24/03/2018 | 0 | 0 | 0 | 0 | 0 | 0 | 0 | 4 | 0 | 5 | 24 |
| 25/03/2018 | 0 | 0 | 0 | 0 | 0 | 0 | 0 | 4 | 0 | 5 | 24 |
| 26/03/2018 | 0 | 0 | 0 | 0 | 0 | 0 | 0 | 4 | 0 | 5 | 24 |
| 27/03/2018 | 0 | 0 | 0 | 0 | 0 | 0 | 0 | 4 | 0 | 5 | 24 |
| 28/03/2018 | 0 | 0 | 0 | 0 | 0 | 0 | 0 | 4 | 0 | 5 | 24 |
| 29/03/2018 | 0 | 0 | 0 | 0 | 0 | 0 | 0 | 4 | 0 | 5 | 24 |
| 30/03/2018 | 0 | 0 | 0 | 0 | 0 | 0 | 0 | 4 | 0 | 5 | 24 |
| 31/03/2018 | 0 | 0 | 0 | 0 | 0 | 0 | 0 | 4 | 0 | 5 | 24 |
| 01/04/2018 | 0 | 0 | 0 | 0 | 0 | 0 | 0 | 4 | 0 | 4 | 13 |